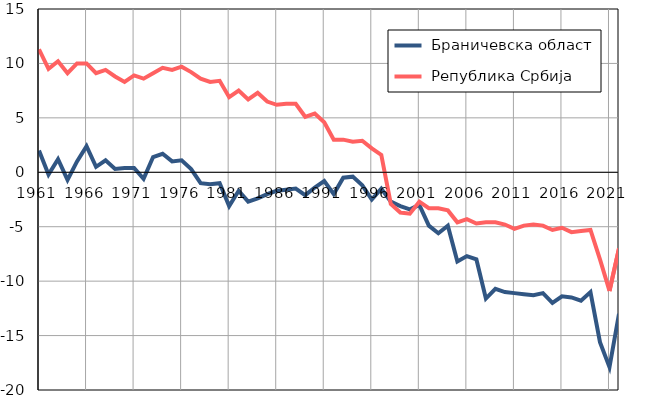
| Category |  Браничевска област |  Република Србија |
|---|---|---|
| 1961.0 | 2 | 11.3 |
| 1962.0 | -0.2 | 9.5 |
| 1963.0 | 1.2 | 10.2 |
| 1964.0 | -0.7 | 9.1 |
| 1965.0 | 1 | 10 |
| 1966.0 | 2.4 | 10 |
| 1967.0 | 0.5 | 9.1 |
| 1968.0 | 1.1 | 9.4 |
| 1969.0 | 0.3 | 8.8 |
| 1970.0 | 0.4 | 8.3 |
| 1971.0 | 0.4 | 8.9 |
| 1972.0 | -0.6 | 8.6 |
| 1973.0 | 1.4 | 9.1 |
| 1974.0 | 1.7 | 9.6 |
| 1975.0 | 1 | 9.4 |
| 1976.0 | 1.1 | 9.7 |
| 1977.0 | 0.3 | 9.2 |
| 1978.0 | -1 | 8.6 |
| 1979.0 | -1.1 | 8.3 |
| 1980.0 | -1 | 8.4 |
| 1981.0 | -3.1 | 6.9 |
| 1982.0 | -1.7 | 7.5 |
| 1983.0 | -2.7 | 6.7 |
| 1984.0 | -2.4 | 7.3 |
| 1985.0 | -2 | 6.5 |
| 1986.0 | -1.7 | 6.2 |
| 1987.0 | -1.6 | 6.3 |
| 1988.0 | -1.5 | 6.3 |
| 1989.0 | -2.1 | 5.1 |
| 1990.0 | -1.4 | 5.4 |
| 1991.0 | -0.8 | 4.6 |
| 1992.0 | -2 | 3 |
| 1993.0 | -0.5 | 3 |
| 1994.0 | -0.4 | 2.8 |
| 1995.0 | -1.2 | 2.9 |
| 1996.0 | -2.5 | 2.2 |
| 1997.0 | -1.5 | 1.6 |
| 1998.0 | -2.7 | -2.9 |
| 1999.0 | -3.1 | -3.7 |
| 2000.0 | -3.4 | -3.8 |
| 2001.0 | -3 | -2.7 |
| 2002.0 | -4.9 | -3.3 |
| 2003.0 | -5.6 | -3.3 |
| 2004.0 | -4.9 | -3.5 |
| 2005.0 | -8.2 | -4.6 |
| 2006.0 | -7.7 | -4.3 |
| 2007.0 | -8 | -4.7 |
| 2008.0 | -11.6 | -4.6 |
| 2009.0 | -10.7 | -4.6 |
| 2010.0 | -11 | -4.8 |
| 2011.0 | -11.1 | -5.2 |
| 2012.0 | -11.2 | -4.9 |
| 2013.0 | -11.3 | -4.8 |
| 2014.0 | -11.1 | -4.9 |
| 2015.0 | -12 | -5.3 |
| 2016.0 | -11.4 | -5.1 |
| 2017.0 | -11.5 | -5.5 |
| 2018.0 | -11.8 | -5.4 |
| 2019.0 | -11 | -5.3 |
| 2020.0 | -15.6 | -8 |
| 2021.0 | -17.9 | -10.9 |
| 2022.0 | -13 | -7 |